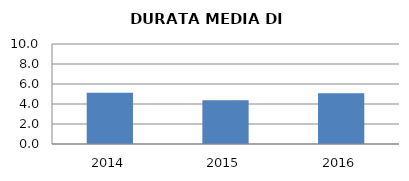
| Category | 2014 2015 2016 |
|---|---|
| 2014.0 | 5.125 |
| 2015.0 | 4.387 |
| 2016.0 | 5.071 |